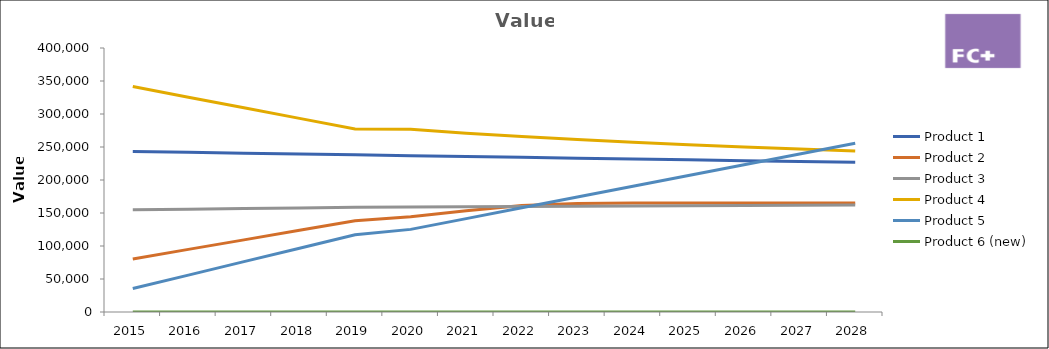
| Category | Product 1 | Product 2 | Product 3 | Product 4 | Product 5 | Product 6 (new) |
|---|---|---|---|---|---|---|
| 2015.0 | 243125 | 80451 | 154784 | 341524 | 35485 | 0 |
| 2016.0 | 241864 | 94875 | 155748 | 325475 | 55874 | 0 |
| 2017.0 | 240603 | 109299 | 156712 | 309426 | 76263 | 0 |
| 2018.0 | 239342 | 123723 | 157676 | 293377 | 96652 | 0 |
| 2019.0 | 238081 | 138147 | 158640 | 277328 | 117041 | 0 |
| 2020.0 | 236820 | 144330.058 | 159020.736 | 277003.434 | 125196.6 | 0 |
| 2021.0 | 235559 | 153545.168 | 159402.386 | 271012.551 | 141507.8 | 0 |
| 2022.0 | 234298 | 161278.817 | 159784.951 | 265823.013 | 157819 | 0 |
| 2023.0 | 233037 | 164254.413 | 160168.435 | 261245.515 | 174130.2 | 0 |
| 2024.0 | 231776 | 165000 | 160552.84 | 257150.804 | 190441.4 | 0 |
| 2025.0 | 230515 | 165000 | 160938.166 | 253446.687 | 206752.6 | 0 |
| 2026.0 | 229254 | 165000 | 161324.418 | 250065.094 | 223063.8 | 0 |
| 2027.0 | 227993 | 165000 | 161711.597 | 246954.329 | 239375 | 0 |
| 2028.0 | 226732 | 165000 | 162099.704 | 244074.211 | 255686.2 | 0 |